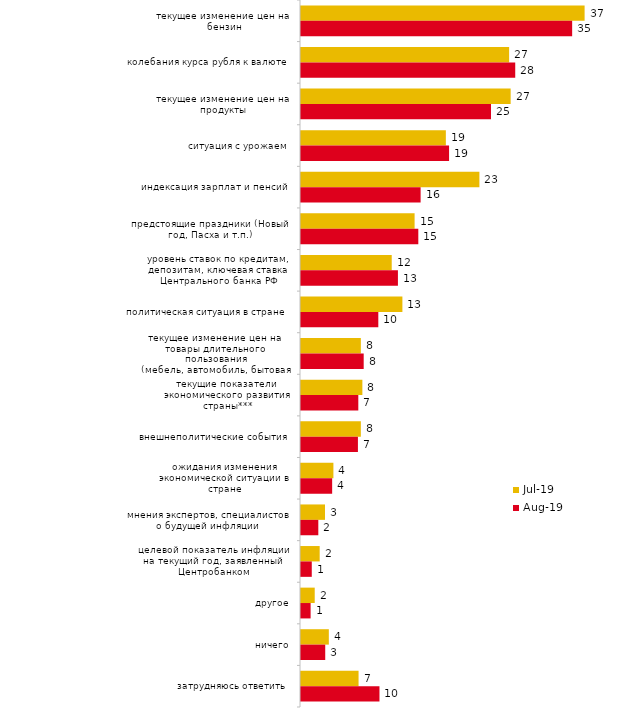
| Category | июл.19 | авг.19 |
|---|---|---|
| текущее изменение цен на бензин | 36.832 | 35.215 |
| колебания курса рубля к валюте | 27.03 | 27.822 |
| текущее изменение цен на продукты | 27.228 | 24.675 |
| ситуация с урожаем | 18.812 | 19.231 |
| индексация зарплат и пенсий | 23.168 | 15.534 |
| предстоящие праздники (Новый год, Пасха и т.п.) | 14.752 | 15.235 |
| уровень ставок по кредитам, депозитам, ключевая ставка Центрального банка РФ | 11.782 | 12.587 |
| политическая ситуация в стране | 13.168 | 10.04 |
| текущее изменение цен на товары длительного пользования (мебель, автомобиль, бытовая техника и т.п.) | 7.772 | 8.142 |
| текущие показатели экономического развития страны*** | 7.97 | 7.443 |
| внешнеполитические события | 7.772 | 7.393 |
| ожидания изменения экономической ситуации в стране | 4.208 | 4.046 |
| мнения экспертов, специалистов о будущей инфляции | 3.119 | 2.248 |
| целевой показатель инфляции на текущий год, заявленный Центробанком | 2.426 | 1.399 |
| другое | 1.782 | 1.249 |
| ничего | 3.614 | 3.147 |
| затрудняюсь ответить | 7.475 | 10.19 |